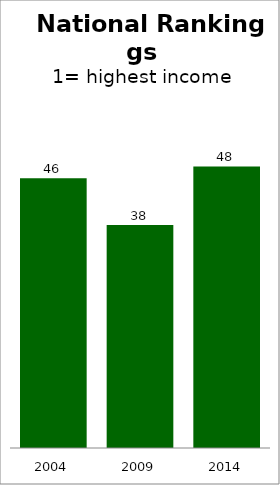
| Category | State |
|---|---|
| 2004.0 | 46 |
| 2009.0 | 38 |
| 2014.0 | 48 |